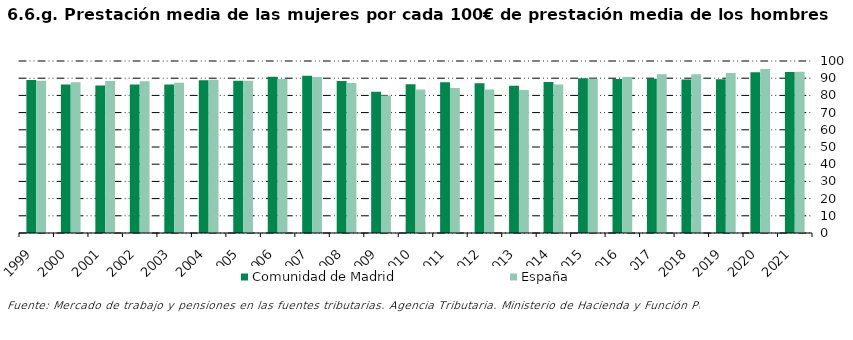
| Category | Comunidad de Madrid | España |
|---|---|---|
| 1999.0 | 88.897 | 88.465 |
| 2000.0 | 86.372 | 87.714 |
| 2001.0 | 85.782 | 88.394 |
| 2002.0 | 86.391 | 88.25 |
| 2003.0 | 86.386 | 87.372 |
| 2004.0 | 88.837 | 89.09 |
| 2005.0 | 88.549 | 88.57 |
| 2006.0 | 90.787 | 89.464 |
| 2007.0 | 91.441 | 90.685 |
| 2008.0 | 88.434 | 87.271 |
| 2009.0 | 82.179 | 79.914 |
| 2010.0 | 86.452 | 83.368 |
| 2011.0 | 87.575 | 84.262 |
| 2012.0 | 87.079 | 83.413 |
| 2013.0 | 85.66 | 83.173 |
| 2014.0 | 87.75 | 86.396 |
| 2015.0 | 89.943 | 89.649 |
| 2016.0 | 89.594 | 90.657 |
| 2017.0 | 89.666 | 92.323 |
| 2018.0 | 89.301 | 92.322 |
| 2019.0 | 89.435 | 92.994 |
| 2020.0 | 93.488 | 95.346 |
| 2021.0 | 93.654 | 93.77 |